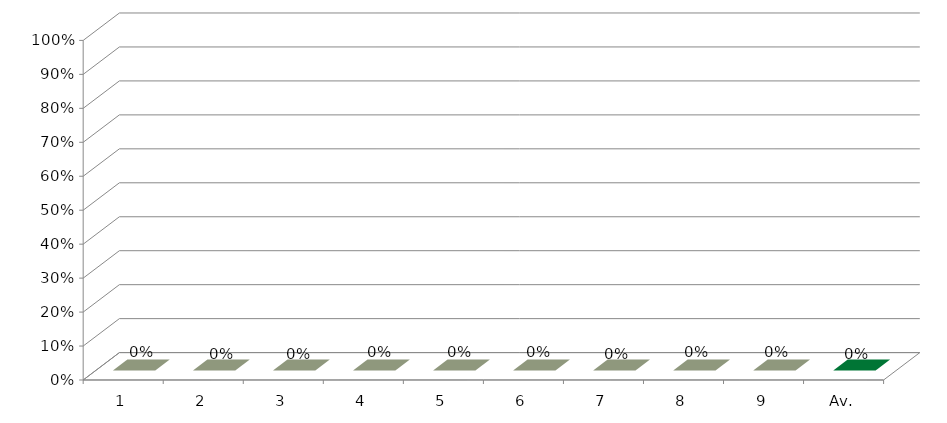
| Category | Series 3 |
|---|---|
| 1 | 0 |
| 2 | 0 |
| 3 | 0 |
| 4 | 0 |
| 5 | 0 |
| 6 | 0 |
| 7 | 0 |
| 8 | 0 |
| 9 | 0 |
| Av. | 0 |